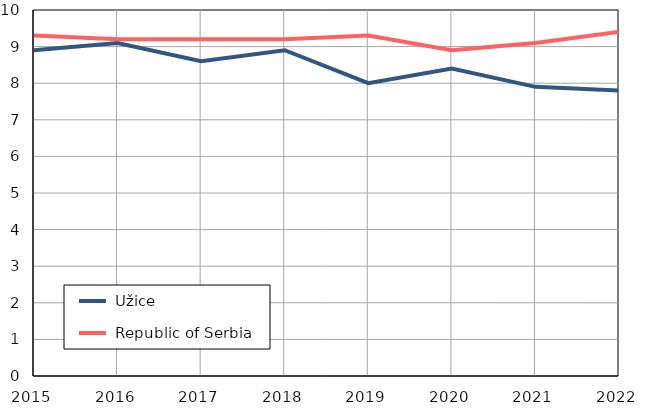
| Category |  Užice |  Republic of Serbia |
|---|---|---|
| 2015.0 | 8.9 | 9.3 |
| 2016.0 | 9.1 | 9.2 |
| 2017.0 | 8.6 | 9.2 |
| 2018.0 | 8.9 | 9.2 |
| 2019.0 | 8 | 9.3 |
| 2020.0 | 8.4 | 8.9 |
| 2021.0 | 7.9 | 9.1 |
| 2022.0 | 7.8 | 9.4 |